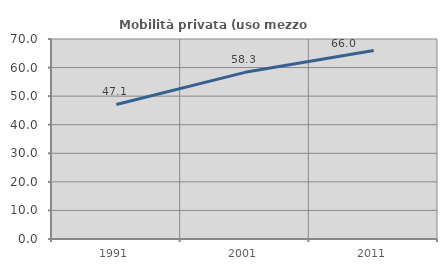
| Category | Mobilità privata (uso mezzo privato) |
|---|---|
| 1991.0 | 47.092 |
| 2001.0 | 58.33 |
| 2011.0 | 65.968 |